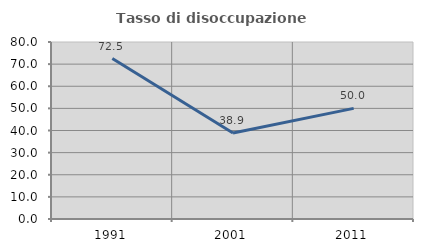
| Category | Tasso di disoccupazione giovanile  |
|---|---|
| 1991.0 | 72.5 |
| 2001.0 | 38.889 |
| 2011.0 | 50 |